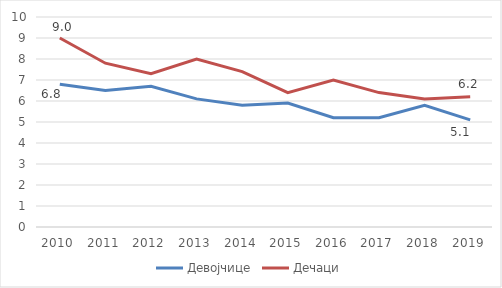
| Category | Девојчице | Дечаци |
|---|---|---|
| 2010.0 | 6.8 | 9 |
| 2011.0 | 6.5 | 7.8 |
| 2012.0 | 6.7 | 7.3 |
| 2013.0 | 6.1 | 8 |
| 2014.0 | 5.8 | 7.4 |
| 2015.0 | 5.9 | 6.4 |
| 2016.0 | 5.2 | 7 |
| 2017.0 | 5.2 | 6.4 |
| 2018.0 | 5.8 | 6.1 |
| 2019.0 | 5.1 | 6.2 |